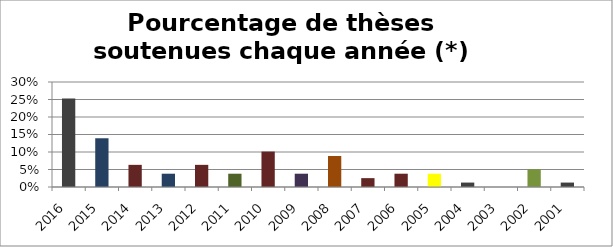
| Category | Nembres des doctorants sotenues chaque année |
|---|---|
| 2016.0 | 0.253 |
| 2015.0 | 0.139 |
| 2014.0 | 0.063 |
| 2013.0 | 0.038 |
| 2012.0 | 0.063 |
| 2011.0 | 0.038 |
| 2010.0 | 0.101 |
| 2009.0 | 0.038 |
| 2008.0 | 0.089 |
| 2007.0 | 0.025 |
| 2006.0 | 0.038 |
| 2005.0 | 0.038 |
| 2004.0 | 0.013 |
| 2003.0 | 0 |
| 2002.0 | 0.051 |
| 2001.0 | 0.013 |